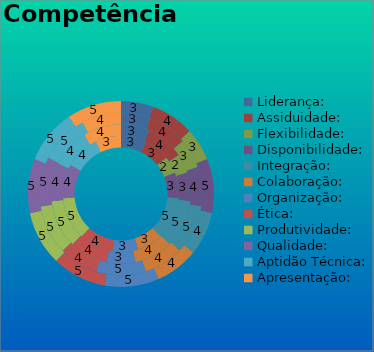
| Category | 1° Trim. | 2° Trim. | 3° Trim | 4° Trim. |
|---|---|---|---|---|
| Liderança: | 3 | 3 | 3 | 3 |
| Assiduidade: | 3 | 4 | 4 | 4 |
| Flexibilidade: | 2 | 2 | 3 | 3 |
| Disponibilidade: | 3 | 3 | 4 | 5 |
| Integração: | 5 | 5 | 5 | 4 |
| Colaboração: | 3 | 4 | 4 | 4 |
| Organização: | 3 | 3 | 5 | 5 |
| Ética: | 4 | 4 | 4 | 5 |
| Produtividade: | 5 | 5 | 5 | 5 |
| Qualidade: | 4 | 4 | 5 | 5 |
| Aptidão Técnica: | 4 | 4 | 5 | 5 |
| Apresentação: | 3 | 4 | 4 | 5 |